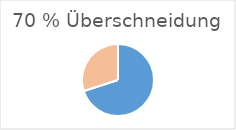
| Category | Series 0 |
|---|---|
| 0 | 70 |
| 1 | 30 |